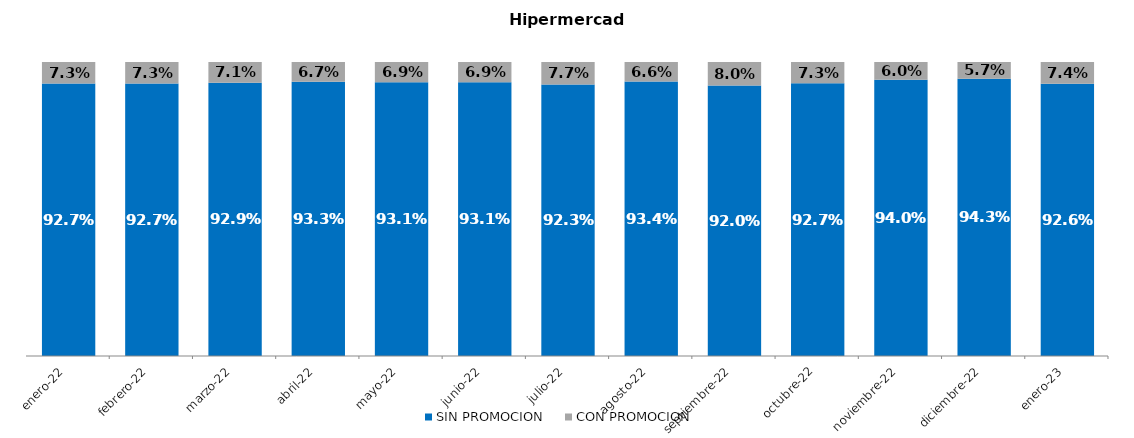
| Category | SIN PROMOCION   | CON PROMOCION   |
|---|---|---|
| 2022-01-01 | 0.927 | 0.073 |
| 2022-02-01 | 0.927 | 0.073 |
| 2022-03-01 | 0.929 | 0.071 |
| 2022-04-01 | 0.933 | 0.067 |
| 2022-05-01 | 0.931 | 0.069 |
| 2022-06-01 | 0.931 | 0.069 |
| 2022-07-01 | 0.923 | 0.077 |
| 2022-08-01 | 0.934 | 0.066 |
| 2022-09-01 | 0.92 | 0.08 |
| 2022-10-01 | 0.927 | 0.073 |
| 2022-11-01 | 0.94 | 0.06 |
| 2022-12-01 | 0.943 | 0.057 |
| 2023-01-01 | 0.926 | 0.074 |